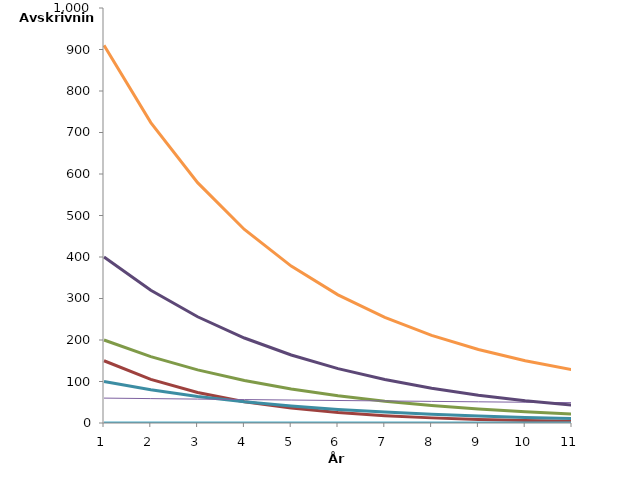
| Category | Kontormaskiner o.l | Ervervet forretningsverdi (goodwil)  | Personbiler,traktorer,andre rullende maskiner | Skip,fartøyer,rigger m.v. | Fly,helikoptre | Anlegg for overføring og distribusjon av elektrisk kraft m.v. | Bygg og anlegg, hoteller | Forretningsbygg | Tomter | Sum | Vogntog,lastebiler,varebiler osv. |
|---|---|---|---|---|---|---|---|---|---|---|---|
| 0 | 150 | 200 | 100 |  |  |  |  | 60 | 0 | 910 | 400 |
| 1 | 105 | 160 | 80 |  |  |  |  | 58.8 | 0 | 723.8 | 320 |
| 2 | 73.5 | 128 | 64 |  |  |  |  | 57.624 | 0 | 579.124 | 256 |
| 3 | 51.45 | 102.4 | 51.2 |  |  |  |  | 56.472 | 0 | 466.322 | 204.8 |
| 4 | 36.015 | 81.92 | 40.96 |  |  |  |  | 55.342 | 0 | 378.077 | 163.84 |
| 5 | 25.21 | 65.536 | 32.768 |  |  |  |  | 54.235 | 0 | 308.822 | 131.072 |
| 6 | 17.647 | 52.429 | 26.214 |  |  |  |  | 53.151 | 0 | 254.299 | 104.858 |
| 7 | 12.353 | 41.943 | 20.972 |  |  |  |  | 52.088 | 0 | 211.241 | 83.886 |
| 8 | 8.647 | 33.554 | 16.777 |  |  |  |  | 51.046 | 0 | 177.133 | 67.109 |
| 9 | 6.053 | 26.844 | 13.422 |  |  |  |  | 50.025 | 0 | 150.03 | 53.687 |
| 10 | 4.237 | 21.475 | 10.737 |  |  |  |  | 49.024 | 0 | 128.423 | 42.95 |